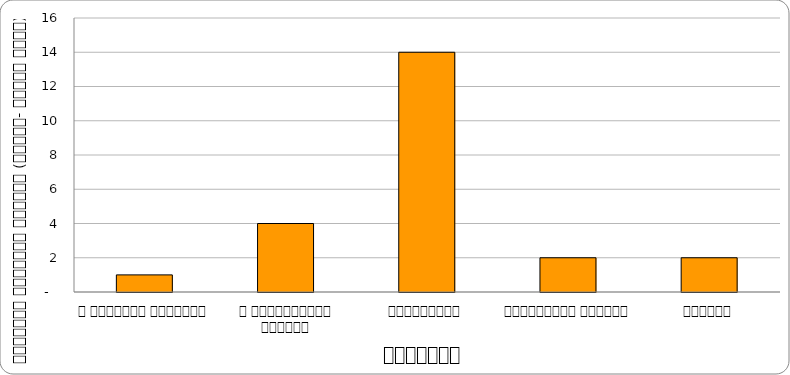
| Category | सुरक्षा |
|---|---|
| द हिमालयन टाइम्स् | 1 |
| द काठमाण्डौं पोस्ट् | 4 |
| कान्तिपुर | 14 |
| अन्नपूर्ण पोस्ट् | 2 |
| नागरिक | 2 |